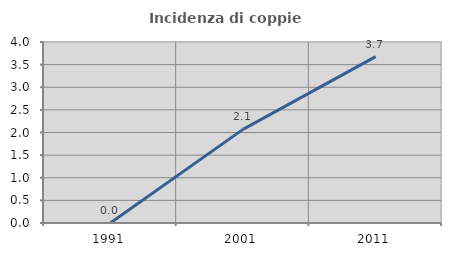
| Category | Incidenza di coppie miste |
|---|---|
| 1991.0 | 0 |
| 2001.0 | 2.069 |
| 2011.0 | 3.676 |